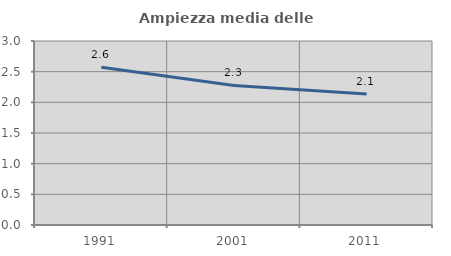
| Category | Ampiezza media delle famiglie |
|---|---|
| 1991.0 | 2.571 |
| 2001.0 | 2.276 |
| 2011.0 | 2.135 |